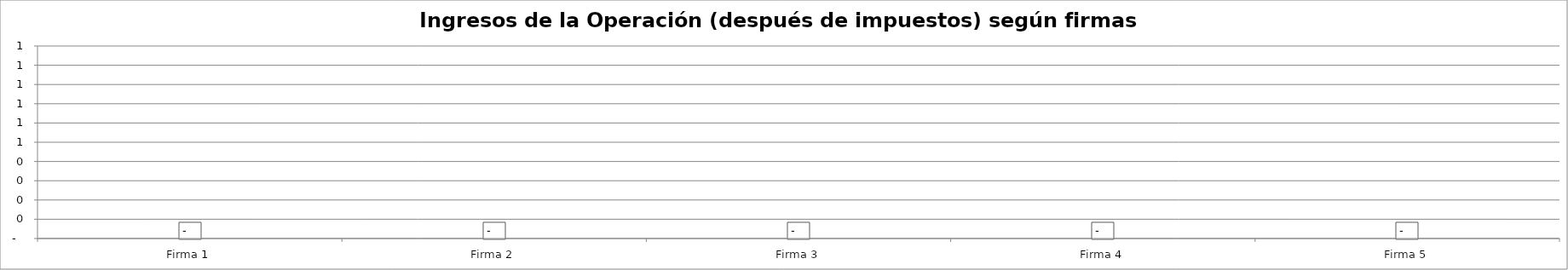
| Category | Ingresos de la Operación (después de impuestos) según firmas simuladas - Año 8 |
|---|---|
| Firma 1 | 0 |
| Firma 2 | 0 |
| Firma 3 | 0 |
| Firma 4 | 0 |
| Firma 5 | 0 |